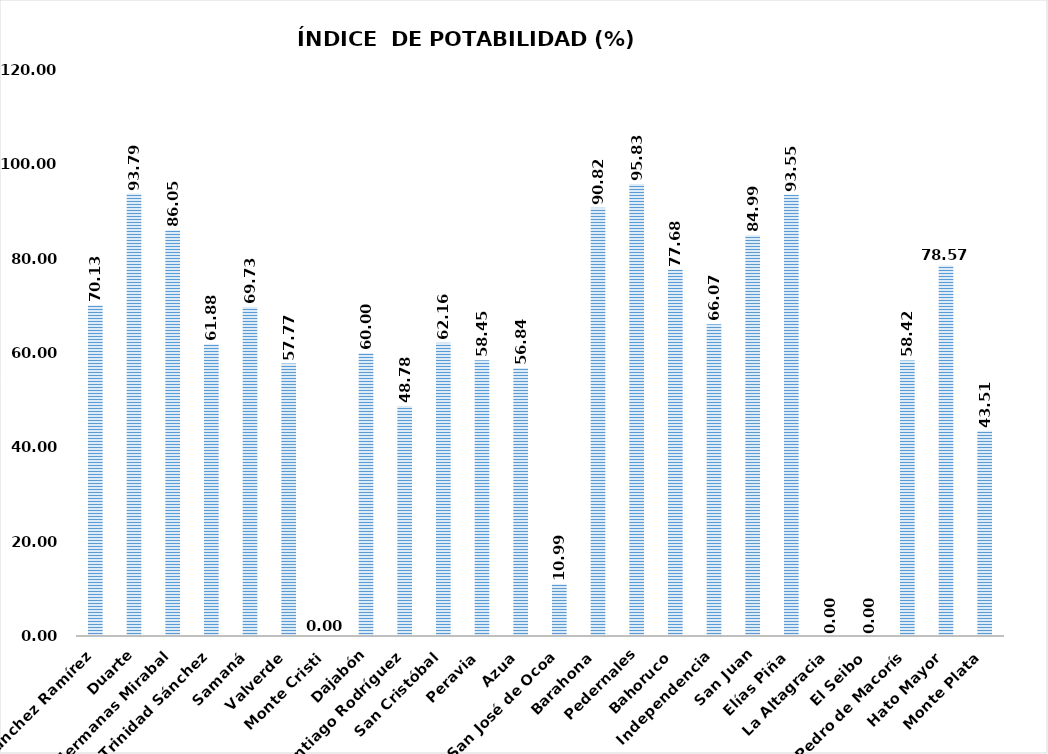
| Category | 70.13  |
|---|---|
| Sánchez Ramírez | 70.13 |
| Duarte | 93.79 |
| Hermanas Mirabal | 86.05 |
| María Trinidad Sánchez | 61.88 |
| Samaná | 69.73 |
| Valverde | 57.77 |
| Monte Cristi | 0 |
| Dajabón | 60 |
| Santiago Rodríguez | 48.78 |
| San Cristóbal | 62.16 |
| Peravia | 58.45 |
| Azua | 56.84 |
| San José de Ocoa | 10.99 |
| Barahona | 90.82 |
| Pedernales | 95.83 |
| Bahoruco | 77.68 |
| Independencia | 66.07 |
| San Juan | 84.99 |
| Elías Piña | 93.55 |
| La Altagracia | 0 |
| El Seibo | 0 |
| San Pedro de Macorís | 58.42 |
| Hato Mayor | 78.57 |
| Monte Plata | 43.51 |